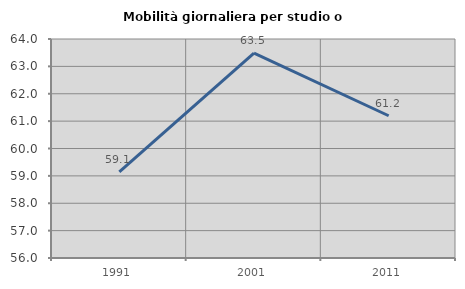
| Category | Mobilità giornaliera per studio o lavoro |
|---|---|
| 1991.0 | 59.143 |
| 2001.0 | 63.483 |
| 2011.0 | 61.197 |